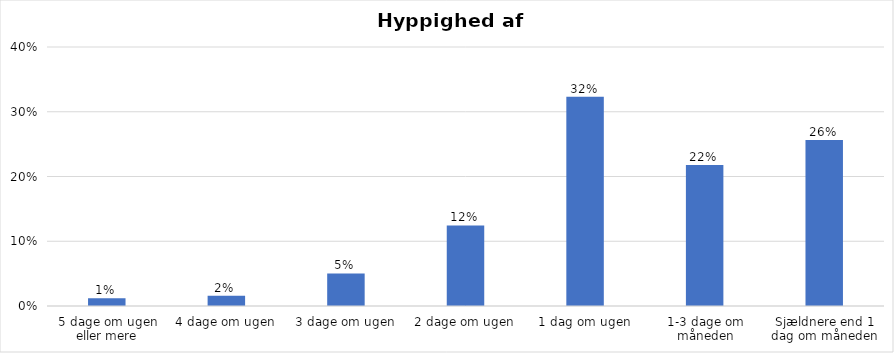
| Category | % |
|---|---|
| 5 dage om ugen eller mere | 0.012 |
| 4 dage om ugen | 0.016 |
| 3 dage om ugen | 0.05 |
| 2 dage om ugen | 0.124 |
| 1 dag om ugen | 0.323 |
| 1-3 dage om måneden | 0.218 |
| Sjældnere end 1 dag om måneden | 0.256 |